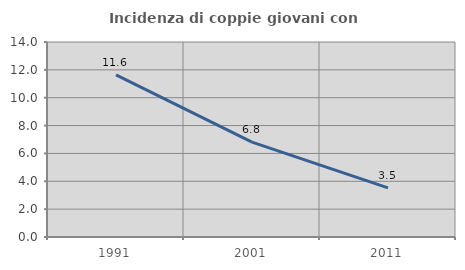
| Category | Incidenza di coppie giovani con figli |
|---|---|
| 1991.0 | 11.637 |
| 2001.0 | 6.81 |
| 2011.0 | 3.524 |